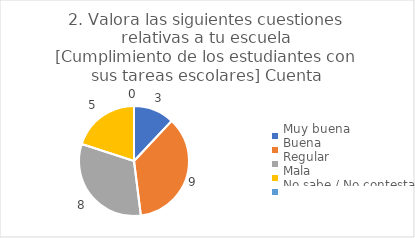
| Category | 2. Valora las siguientes cuestiones relativas a tu escuela
[Cumplimiento de los estudiantes con sus tareas escolares] |
|---|---|
| Muy buena  | 0.12 |
| Buena  | 0.36 |
| Regular  | 0.32 |
| Mala  | 0.2 |
| No sabe / No contesta | 0 |